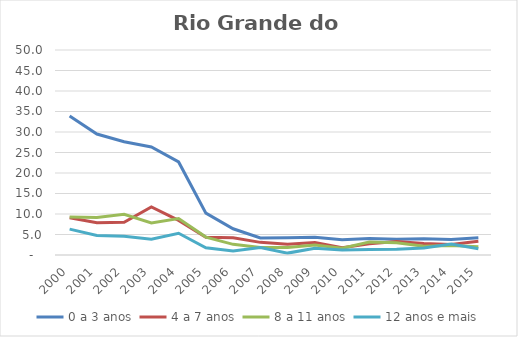
| Category | 0 a 3 anos | 4 a 7 anos | 8 a 11 anos | 12 anos e mais |
|---|---|---|---|---|
| 2000.0 | 33.915 | 9.091 | 9.264 | 6.303 |
| 2001.0 | 29.499 | 7.875 | 9.16 | 4.762 |
| 2002.0 | 27.627 | 7.993 | 9.925 | 4.577 |
| 2003.0 | 26.359 | 11.734 | 7.822 | 3.858 |
| 2004.0 | 22.7 | 8.438 | 8.88 | 5.31 |
| 2005.0 | 10.223 | 4.314 | 4.363 | 1.77 |
| 2006.0 | 6.392 | 4.203 | 2.6 | 0.955 |
| 2007.0 | 4.171 | 3.082 | 1.815 | 1.852 |
| 2008.0 | 4.223 | 2.595 | 1.836 | 0.464 |
| 2009.0 | 4.343 | 3.052 | 2.453 | 1.659 |
| 2010.0 | 3.741 | 1.796 | 1.654 | 1.235 |
| 2011.0 | 4.005 | 2.738 | 3.18 | 1.316 |
| 2012.0 | 3.846 | 3.282 | 2.968 | 1.408 |
| 2013.0 | 3.977 | 2.786 | 2.155 | 1.732 |
| 2014.0 | 3.787 | 2.538 | 2.334 | 2.687 |
| 2015.0 | 4.234 | 3.381 | 1.995 | 1.512 |